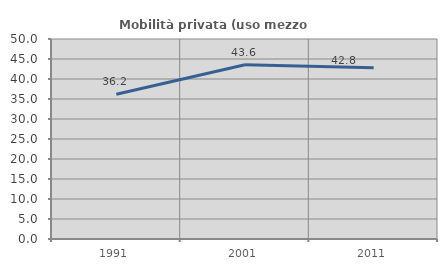
| Category | Mobilità privata (uso mezzo privato) |
|---|---|
| 1991.0 | 36.176 |
| 2001.0 | 43.56 |
| 2011.0 | 42.799 |